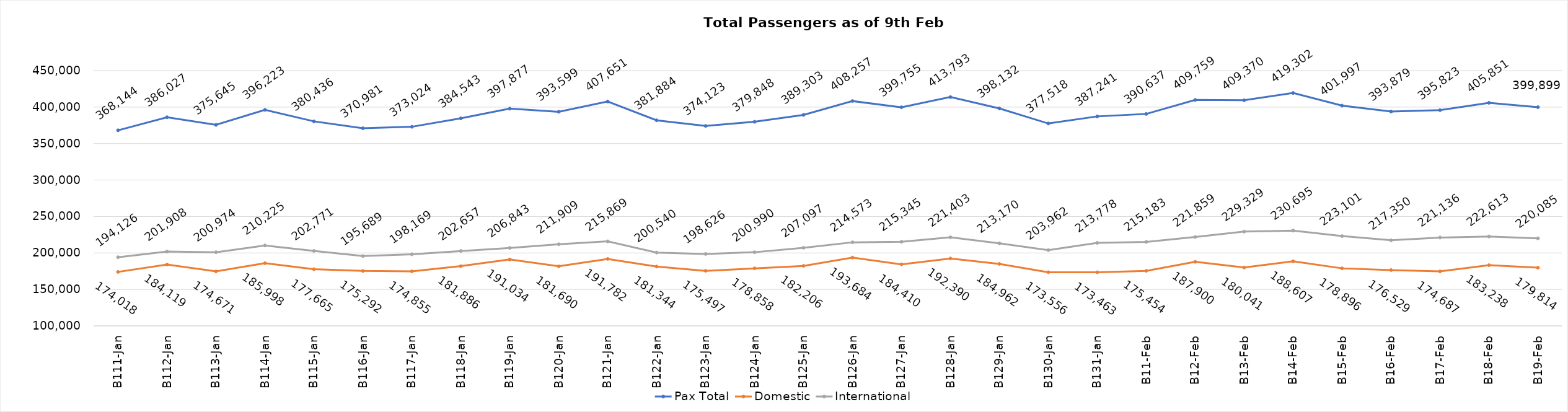
| Category | Pax Total | Domestic | International |
|---|---|---|---|
| 2024-01-11 | 368144 | 174018 | 194126 |
| 2024-01-12 | 386027 | 184119 | 201908 |
| 2024-01-13 | 375645 | 174671 | 200974 |
| 2024-01-14 | 396223 | 185998 | 210225 |
| 2024-01-15 | 380436 | 177665 | 202771 |
| 2024-01-16 | 370981 | 175292 | 195689 |
| 2024-01-17 | 373024 | 174855 | 198169 |
| 2024-01-18 | 384543 | 181886 | 202657 |
| 2024-01-19 | 397877 | 191034 | 206843 |
| 2024-01-20 | 393599 | 181690 | 211909 |
| 2024-01-21 | 407651 | 191782 | 215869 |
| 2024-01-22 | 381884 | 181344 | 200540 |
| 2024-01-23 | 374123 | 175497 | 198626 |
| 2024-01-24 | 379848 | 178858 | 200990 |
| 2024-01-25 | 389303 | 182206 | 207097 |
| 2024-01-26 | 408257 | 193684 | 214573 |
| 2024-01-27 | 399755 | 184410 | 215345 |
| 2024-01-28 | 413793 | 192390 | 221403 |
| 2024-01-29 | 398132 | 184962 | 213170 |
| 2024-01-30 | 377518 | 173556 | 203962 |
| 2024-01-31 | 387241 | 173463 | 213778 |
| 2024-02-01 | 390637 | 175454 | 215183 |
| 2024-02-02 | 409759 | 187900 | 221859 |
| 2024-02-03 | 409370 | 180041 | 229329 |
| 2024-02-04 | 419302 | 188607 | 230695 |
| 2024-02-05 | 401997 | 178896 | 223101 |
| 2024-02-06 | 393879 | 176529 | 217350 |
| 2024-02-07 | 395823 | 174687 | 221136 |
| 2024-02-08 | 405851 | 183238 | 222613 |
| 2024-02-09 | 399899 | 179814 | 220085 |